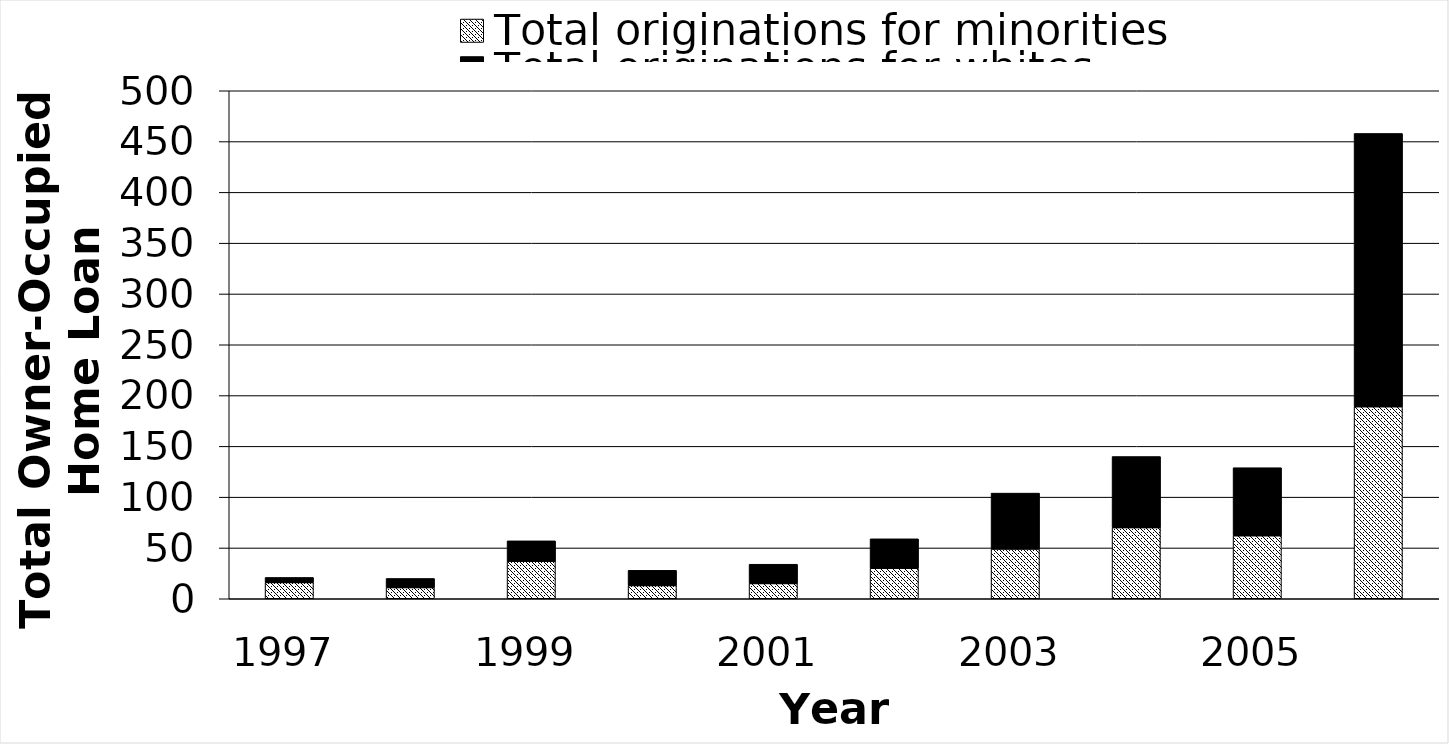
| Category | Total originations for minorities | Total originations for whites |
|---|---|---|
| 1997.0 | 16 | 5 |
| 1998.0 | 11 | 9 |
| 1999.0 | 37 | 20 |
| 2000.0 | 13 | 15 |
| 2001.0 | 15 | 19 |
| 2002.0 | 30 | 29 |
| 2003.0 | 49 | 55 |
| 2004.0 | 70 | 70 |
| 2005.0 | 62 | 67 |
| 2006.0 | 189 | 269 |